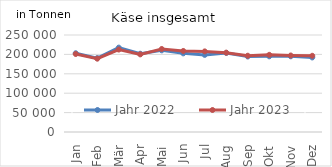
| Category | Jahr 2022 | Jahr 2023 |
|---|---|---|
| 0 | 202958.987 | 201057.313 |
| 1 | 190439.558 | 189028.432 |
| 2 | 217451.898 | 212500.467 |
| 3 | 201667.787 | 200074.443 |
| 4 | 210463.747 | 213925.028 |
| 5 | 202687.091 | 208840.091 |
| 6 | 198739.293 | 207736.829 |
| 7 | 203754.912 | 204497.852 |
| 8 | 194594.221 | 196560.416 |
| 9 | 195066.959 | 198853.411 |
| 10 | 195141.974 | 197161.505 |
| 11 | 192155.94 | 196394.732 |